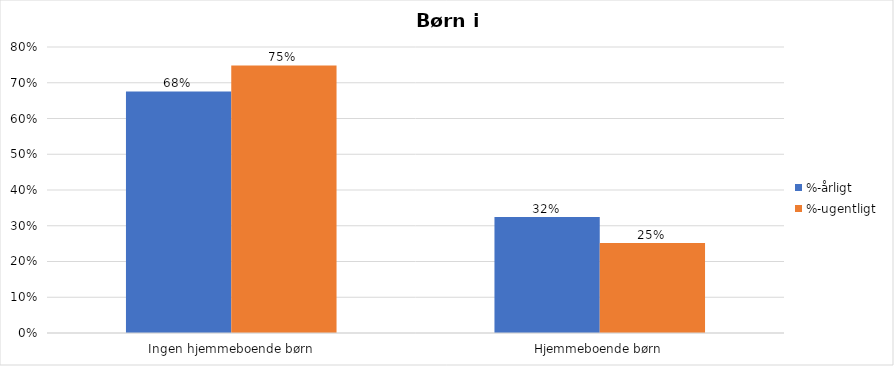
| Category | %-årligt | %-ugentligt |
|---|---|---|
| Ingen hjemmeboende børn | 0.676 | 0.748 |
| Hjemmeboende børn | 0.324 | 0.252 |